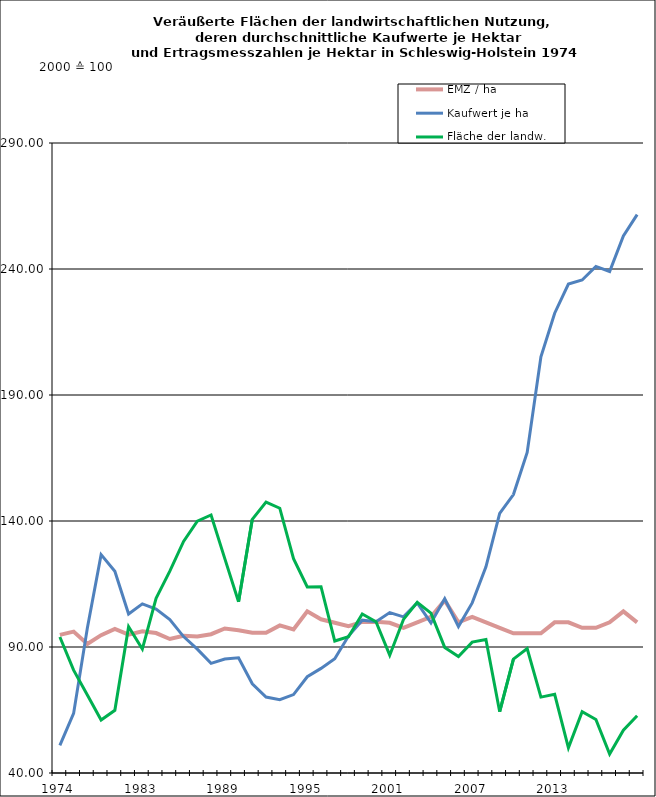
| Category | EMZ / ha | Kaufwert je ha | Fläche der landw. Nutzung |
|---|---|---|---|
| 1974.0 | 94.795 | 51 | 93.981 |
| 1976.0 | 96.097 | 63.639 | 80.798 |
| 1978.0 | 91.177 | 97.503 | 70.981 |
| 1980.0 | 94.702 | 126.649 | 61.017 |
| 1981.0 | 97.202 | 120.065 | 64.89 |
| 1982.0 | 94.914 | 103.096 | 98.077 |
| 1983.0 | 96.246 | 107.125 | 89.198 |
| 1984.0 | 95.527 | 105.048 | 109.324 |
| 1985.0 | 93.182 | 100.843 | 120.09 |
| 1986.0 | 94.48 | 94.135 | 131.88 |
| 1987.0 | 94.141 | 89.159 | 139.897 |
| 1988.0 | 95.081 | 83.528 | 142.385 |
| 1989.0 | 97.343 | 85.246 | 125.065 |
| 1990.0 | 96.683 | 85.684 | 107.96 |
| 1991.0 | 95.675 | 75.423 | 140.67 |
| 1992.0 | 95.651 | 70.143 | 147.485 |
| 1993.0 | 98.57 | 69.101 | 145.071 |
| 1994.0 | 96.941 | 71.113 | 125.075 |
| 1995.0 | 104.16 | 78.2 | 113.839 |
| 1996.0 | 101.007 | 81.509 | 113.945 |
| 1997.0 | 99.604 | 85.367 | 92.368 |
| 1998.0 | 98.258 | 94.343 | 94.074 |
| 1999.0 | 99.97 | 100.651 | 103.111 |
| 2000.0 | 100 | 100 | 100 |
| 2001.0 | 99.588 | 103.657 | 86.753 |
| 2002.0 | 97.614 | 101.94 | 100.958 |
| 2003.0 | 99.783 | 107.499 | 107.763 |
| 2004.0 | 101.952 | 99.575 | 103.431 |
| 2005.0 | 108.46 | 109.153 | 89.843 |
| 2006.0 | 99.783 | 98.107 | 86.202 |
| 2007.0 | 101.952 | 107.508 | 91.94 |
| 2008.0 | 99.783 | 121.845 | 93.002 |
| 2009.0 | 97.614 | 143.056 | 64.336 |
| 2010.0 | 95.445 | 150.509 | 85.196 |
| 2011.0 | 95.445 | 167.176 | 89.386 |
| 2012.0 | 95.445 | 205.117 | 70.111 |
| 2013.0 | 99.783 | 222.46 | 71.215 |
| 2014.0 | 99.783 | 234.004 | 50.013 |
| 2015.0 | 97.614 | 235.632 | 64.355 |
| 2016.0 | 97.614 | 241.03 | 61.26 |
| 2017.0 | 99.783 | 239.02 | 47.529 |